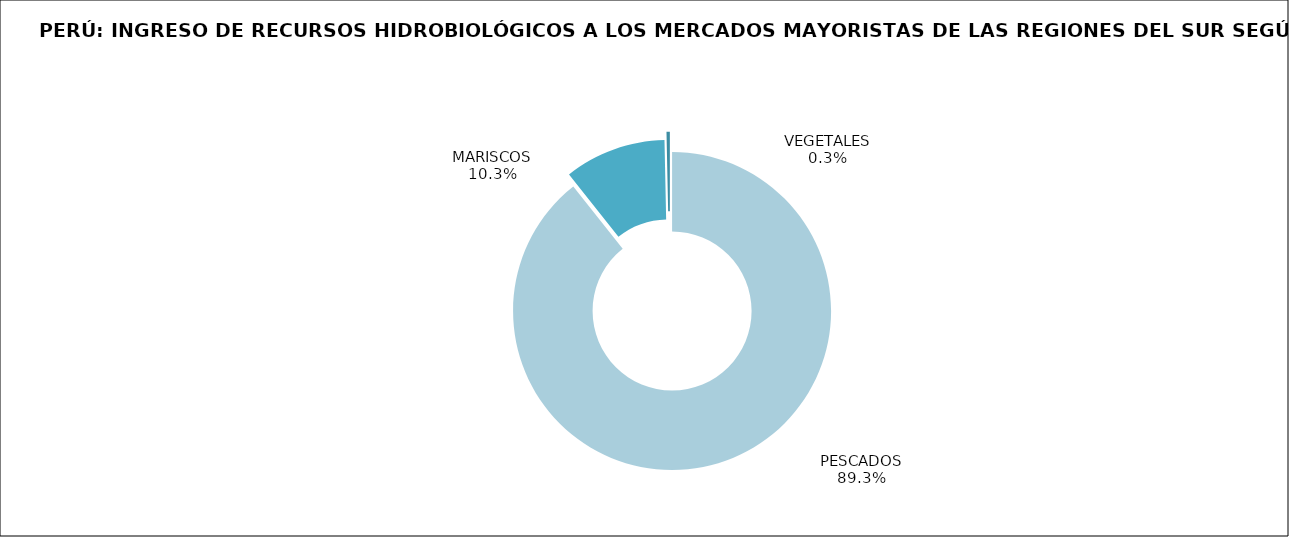
| Category | Series 0 |
|---|---|
| PESCADOS | 14103.509 |
| MARISCOS | 1632.135 |
| VEGETALES | 53.209 |